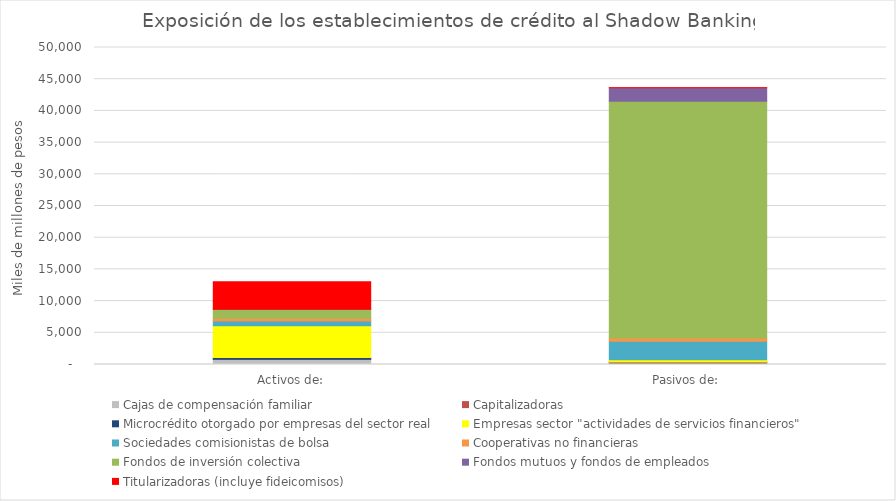
| Category | Cajas de compensación familiar | Capitalizadoras | Microcrédito otorgado por empresas del sector real | Empresas sector "actividades de servicios financieros" | Sociedades comisionistas de bolsa | Cooperativas no financieras | Fondos de inversión colectiva | Fondos mutuos y fondos de empleados | Titularizadoras (incluye fideicomisos) |
|---|---|---|---|---|---|---|---|---|---|
| Activos de: | 816.4 | 21.431 | 249.764 | 5032.045 | 758.783 | 405.613 | 1434.065 | 0.006 | 4314.666 |
| Pasivos de: | 176.645 | 199.367 | 8.911 | 364.812 | 2897.745 | 521.502 | 37340.343 | 2146.885 | 12.062 |